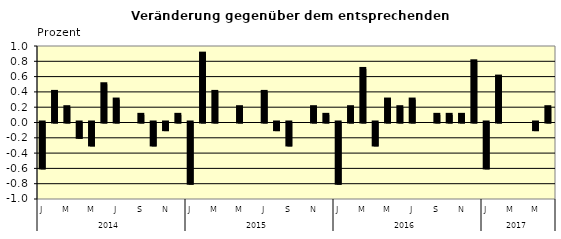
| Category | Series 0 |
|---|---|
| 0 | -0.6 |
| 1 | 0.4 |
| 2 | 0.2 |
| 3 | -0.2 |
| 4 | -0.3 |
| 5 | 0.5 |
| 6 | 0.3 |
| 7 | 0 |
| 8 | 0.1 |
| 9 | -0.3 |
| 10 | -0.1 |
| 11 | 0.1 |
| 12 | -0.8 |
| 13 | 0.9 |
| 14 | 0.4 |
| 15 | 0 |
| 16 | 0.2 |
| 17 | 0 |
| 18 | 0.4 |
| 19 | -0.1 |
| 20 | -0.3 |
| 21 | 0 |
| 22 | 0.2 |
| 23 | 0.1 |
| 24 | -0.8 |
| 25 | 0.2 |
| 26 | 0.7 |
| 27 | -0.3 |
| 28 | 0.3 |
| 29 | 0.2 |
| 30 | 0.3 |
| 31 | 0 |
| 32 | 0.1 |
| 33 | 0.1 |
| 34 | 0.1 |
| 35 | 0.8 |
| 36 | -0.6 |
| 37 | 0.6 |
| 38 | 0 |
| 39 | 0 |
| 40 | -0.1 |
| 41 | 0.2 |